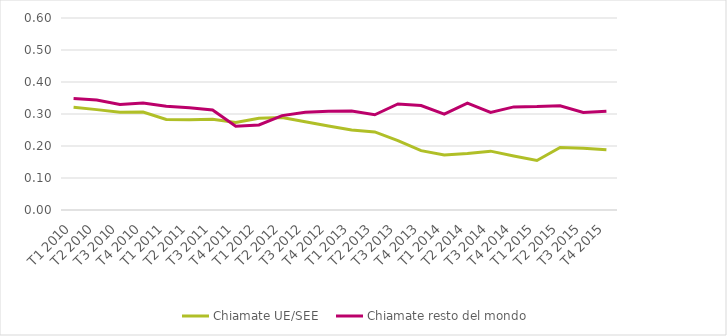
| Category | Chiamate UE/SEE | Chiamate resto del mondo  |
|---|---|---|
| T1 2010 | 0.321 | 0.348 |
| T2 2010 | 0.314 | 0.344 |
| T3 2010 | 0.305 | 0.33 |
| T4 2010 | 0.306 | 0.334 |
| T1 2011 | 0.283 | 0.324 |
| T2 2011 | 0.282 | 0.319 |
| T3 2011 | 0.283 | 0.312 |
| T4 2011 | 0.274 | 0.262 |
| T1 2012 | 0.286 | 0.266 |
| T2 2012 | 0.289 | 0.295 |
| T3 2012 | 0.276 | 0.305 |
| T4 2012 | 0.262 | 0.308 |
| T1 2013 | 0.25 | 0.309 |
| T2 2013 | 0.244 | 0.298 |
| T3 2013 | 0.217 | 0.331 |
| T4 2013 | 0.185 | 0.326 |
| T1 2014 | 0.172 | 0.3 |
| T2 2014 | 0.177 | 0.334 |
| T3 2014 | 0.184 | 0.305 |
| T4 2014 | 0.169 | 0.322 |
| T1 2015 | 0.155 | 0.323 |
| T2 2015 | 0.195 | 0.326 |
| T3 2015 | 0.193 | 0.305 |
| T4 2015 | 0.188 | 0.309 |